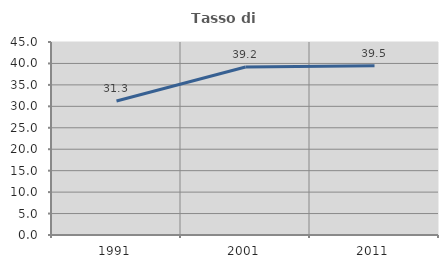
| Category | Tasso di occupazione   |
|---|---|
| 1991.0 | 31.25 |
| 2001.0 | 39.164 |
| 2011.0 | 39.49 |